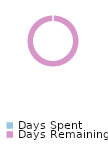
| Category | Series 0 |
|---|---|
| Days Spent | 0 |
| Days Remaining | 365 |